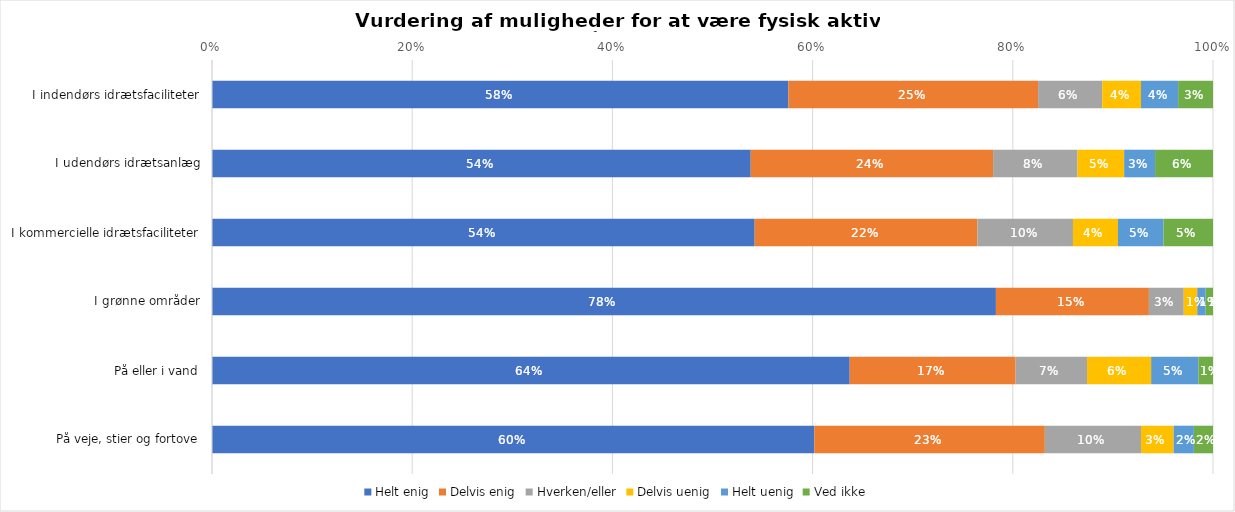
| Category | Helt enig | Delvis enig | Hverken/eller | Delvis uenig | Helt uenig | Ved ikke |
|---|---|---|---|---|---|---|
| I indendørs idrætsfaciliteter | 0.576 | 0.249 | 0.064 | 0.039 | 0.037 | 0.035 |
| I udendørs idrætsanlæg | 0.538 | 0.242 | 0.084 | 0.047 | 0.031 | 0.058 |
| I kommercielle idrætsfaciliteter | 0.542 | 0.222 | 0.096 | 0.045 | 0.046 | 0.049 |
| I grønne områder | 0.783 | 0.153 | 0.035 | 0.013 | 0.008 | 0.007 |
| På eller i vand | 0.637 | 0.166 | 0.071 | 0.064 | 0.047 | 0.015 |
| På veje, stier og fortove | 0.602 | 0.23 | 0.096 | 0.033 | 0.02 | 0.019 |